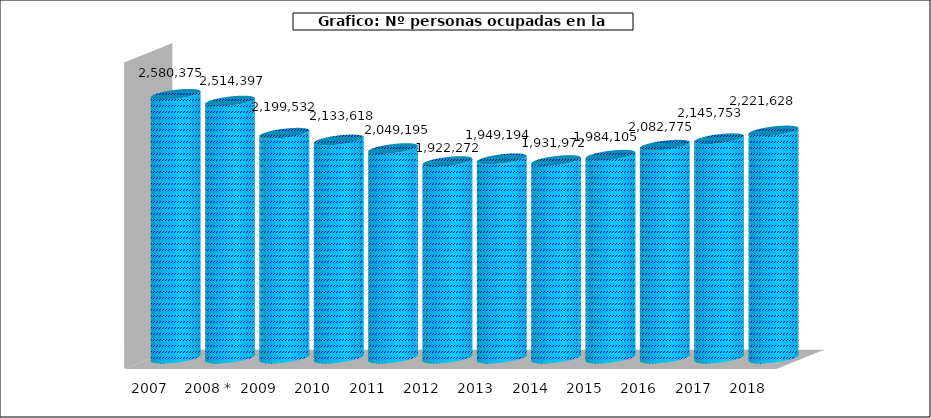
| Category |  Nº personas ocupadas |
|---|---|
| 2007 | 2580375 |
|  2008 * | 2514397 |
| 2009 | 2199532 |
| 2010 | 2133618 |
| 2011 | 2049195 |
| 2012 | 1922272 |
| 2013 | 1949194 |
| 2014 | 1931972 |
| 2015 | 1984105 |
| 2016 | 2082775 |
| 2017 | 2145753 |
| 2018 | 2221628 |